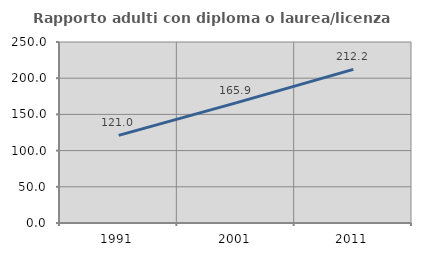
| Category | Rapporto adulti con diploma o laurea/licenza media  |
|---|---|
| 1991.0 | 121.016 |
| 2001.0 | 165.887 |
| 2011.0 | 212.188 |